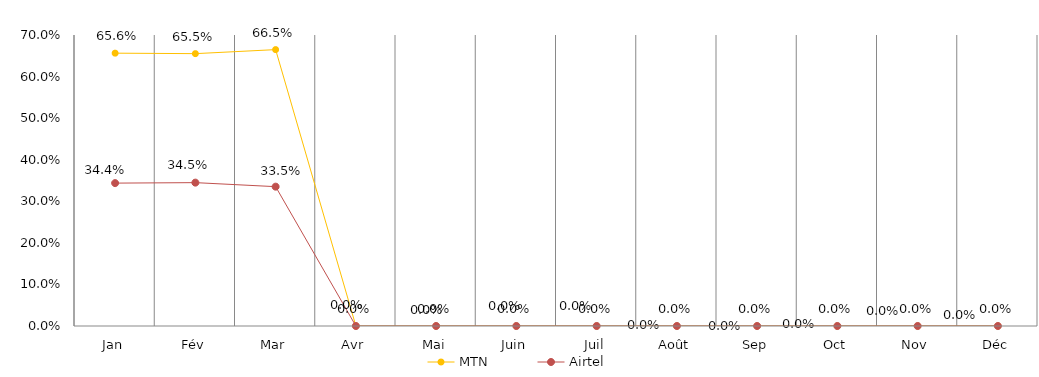
| Category | MTN | Airtel |
|---|---|---|
| Jan | 0.656 | 0.344 |
| Fév | 0.655 | 0.345 |
| Mar | 0.665 | 0.335 |
| Avr | 0 | 0 |
| Mai | 0 | 0 |
| Juin | 0 | 0 |
| Juil | 0 | 0 |
| Août | 0 | 0 |
| Sep | 0 | 0 |
| Oct | 0 | 0 |
| Nov | 0 | 0 |
| Déc | 0 | 0 |